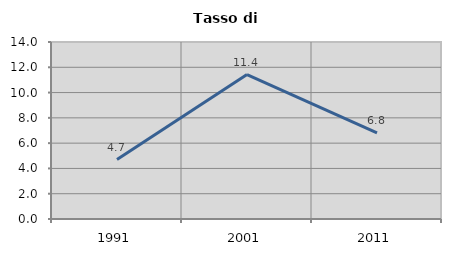
| Category | Tasso di disoccupazione   |
|---|---|
| 1991.0 | 4.698 |
| 2001.0 | 11.429 |
| 2011.0 | 6.818 |